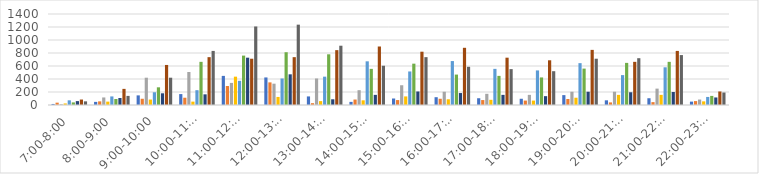
| Category | Series 0 | Series 1 | Series 2 | Series 3 | Series 4 | Series 5 | Series 6 | Series 7 | Series 8 |
|---|---|---|---|---|---|---|---|---|---|
| 7:00-8:00 | 16 | 36 | 12 | 24 | 72 | 40 | 60 | 84 | 56 |
| 8:00-9:00 | 48 | 56 | 116 | 52 | 132 | 92 | 108 | 248 | 140 |
| 9:00-10:00 | 148 | 96 | 420 | 84 | 196 | 272 | 180 | 616 | 420 |
| 10:00-11:00 | 168 | 112 | 508 | 52 | 228 | 664 | 164 | 736 | 832 |
| 11:00-12:00 | 448 | 292 | 340 | 436 | 372 | 760 | 728 | 712 | 1208 |
| 12:00-13:00 | 424 | 348 | 328 | 124 | 408 | 812 | 472 | 736 | 1236 |
| 13:00-14:00 | 132 | 28 | 408 | 60 | 436 | 780 | 88 | 844 | 912 |
| 14:00-15:00 | 48 | 84 | 228 | 72 | 672 | 556 | 156 | 900 | 604 |
| 15:00-16:00 | 100 | 76 | 304 | 132 | 516 | 636 | 208 | 820 | 736 |
| 16:00-17:00 | 120 | 96 | 204 | 88 | 676 | 468 | 184 | 880 | 588 |
| 17:00-18:00 | 104 | 76 | 172 | 80 | 556 | 448 | 156 | 728 | 552 |
| 18:00-19:00 | 96 | 68 | 156 | 68 | 532 | 424 | 136 | 688 | 520 |
| 19:00-20:00 | 152 | 92 | 204 | 112 | 644 | 560 | 204 | 848 | 712 |
| 20:00-21:00 | 72 | 40 | 204 | 156 | 460 | 648 | 196 | 664 | 720 |
| 21:00-22:00 | 104 | 44 | 252 | 156 | 580 | 664 | 200 | 832 | 768 |
| 22:00-23:00 | 52 | 60 | 84 | 56 | 124 | 140 | 116 | 208 | 192 |